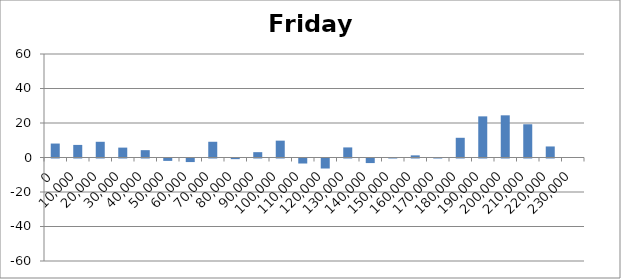
| Category | Friday 24 |
|---|---|
| 0.0 | 8.089 |
| 10000.0 | 7.295 |
| 20000.0 | 9.11 |
| 30000.0 | 5.732 |
| 40000.0 | 4.253 |
| 50000.0 | -1.384 |
| 60000.0 | -2.068 |
| 70000.0 | 9.121 |
| 80000.0 | -0.374 |
| 90000.0 | 3.095 |
| 100000.0 | 9.768 |
| 110000.0 | -2.905 |
| 120000.0 | -5.805 |
| 130000.0 | 5.842 |
| 140000.0 | -2.653 |
| 150000.0 | 0.158 |
| 160000.0 | 1.242 |
| 170000.0 | 0.2 |
| 180000.0 | 11.426 |
| 190000.0 | 23.847 |
| 200000.0 | 24.453 |
| 210000.0 | 19.267 |
| 220000.0 | 6.4 |
| 230000.0 | 0 |